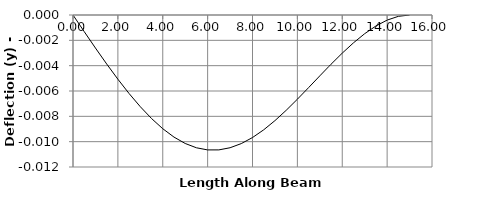
| Category | y |
|---|---|
| 0.0 | 0 |
| 0.5 | -0.001 |
| 1.0 | -0.003 |
| 1.5 | -0.004 |
| 2.0 | -0.005 |
| 2.5 | -0.006 |
| 3.0 | -0.007 |
| 3.5 | -0.008 |
| 4.0 | -0.009 |
| 4.5 | -0.01 |
| 5.0 | -0.01 |
| 5.5 | -0.01 |
| 6.0 | -0.011 |
| 6.0 | -0.011 |
| 6.5 | -0.011 |
| 7.0 | -0.01 |
| 7.5 | -0.01 |
| 8.0 | -0.01 |
| 8.5 | -0.009 |
| 9.0 | -0.008 |
| 9.5 | -0.008 |
| 10.0 | -0.007 |
| 10.5 | -0.006 |
| 11.0 | -0.005 |
| 11.4 | -0.004 |
| 11.5 | -0.004 |
| 12.0 | -0.003 |
| 12.5 | -0.002 |
| 13.0 | -0.001 |
| 13.5 | -0.001 |
| 14.0 | 0 |
| 14.5 | 0 |
| 15.0 | 0 |
| 15.0 | 0 |